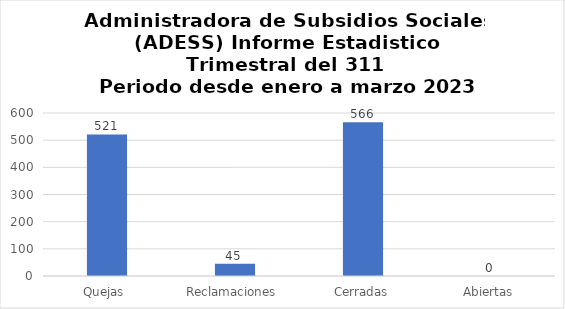
| Category | Series 0 |
|---|---|
| Quejas  | 521 |
| Reclamaciones  | 45 |
| Cerradas | 566 |
| Abiertas  | 0 |